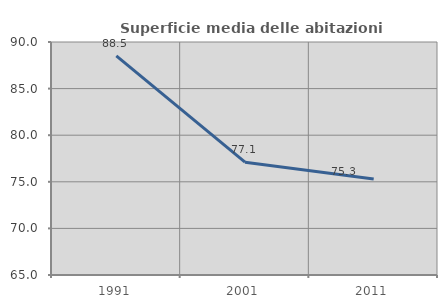
| Category | Superficie media delle abitazioni occupate |
|---|---|
| 1991.0 | 88.508 |
| 2001.0 | 77.102 |
| 2011.0 | 75.3 |